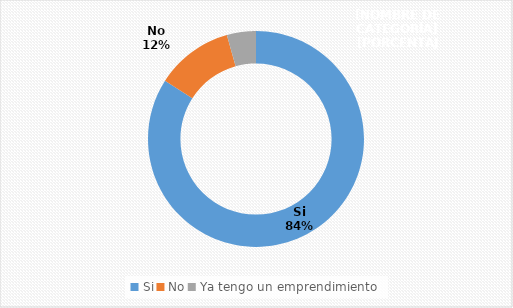
| Category | Series 0 |
|---|---|
| Si | 0.841 |
| No | 0.116 |
| Ya tengo un emprendimiento | 0.043 |